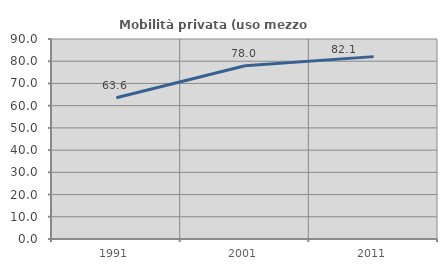
| Category | Mobilità privata (uso mezzo privato) |
|---|---|
| 1991.0 | 63.551 |
| 2001.0 | 77.966 |
| 2011.0 | 82.069 |